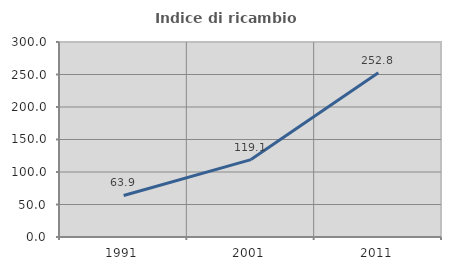
| Category | Indice di ricambio occupazionale  |
|---|---|
| 1991.0 | 63.931 |
| 2001.0 | 119.06 |
| 2011.0 | 252.809 |